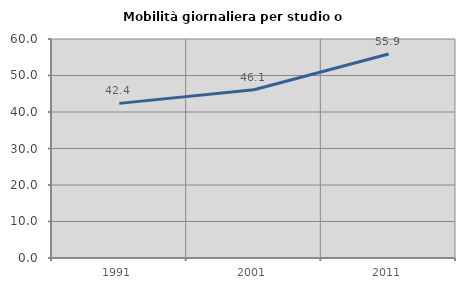
| Category | Mobilità giornaliera per studio o lavoro |
|---|---|
| 1991.0 | 42.363 |
| 2001.0 | 46.085 |
| 2011.0 | 55.898 |